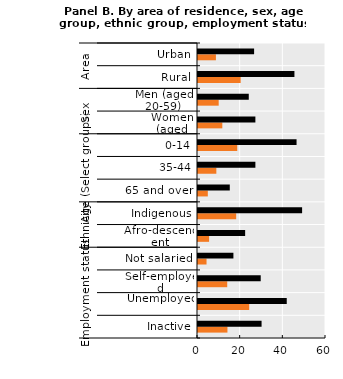
| Category | Extreme Poverty | Poverty |
|---|---|---|
| 0 | 13.8 | 29.8 |
| 1 | 24 | 41.6 |
| 2 | 13.7 | 29.4 |
| 3 | 4 | 16.6 |
| 4 | 5.2 | 22.1 |
| 5 | 17.9 | 48.8 |
| 6 | 4.6 | 14.9 |
| 7 | 8.6 | 26.9 |
| 8 | 18.4 | 46.2 |
| 9 | 11.4 | 26.9 |
| 10 | 9.7 | 23.8 |
| 11 | 20 | 45.2 |
| 12 | 8.4 | 26.3 |